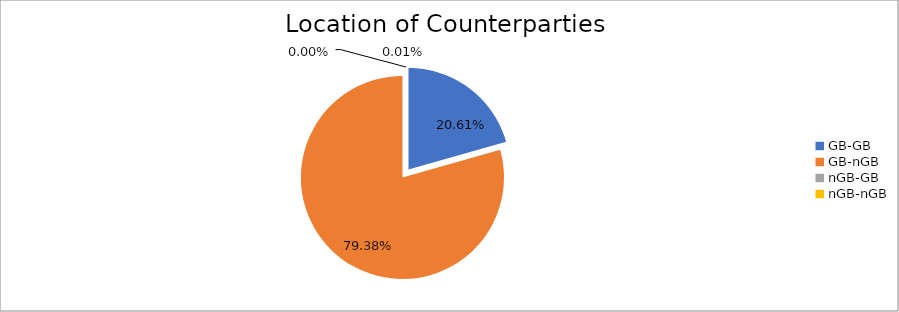
| Category | Series 0 |
|---|---|
| GB-GB | 2534561.305 |
| GB-nGB | 9762712.337 |
| nGB-GB | 203.134 |
| nGB-nGB | 663.888 |